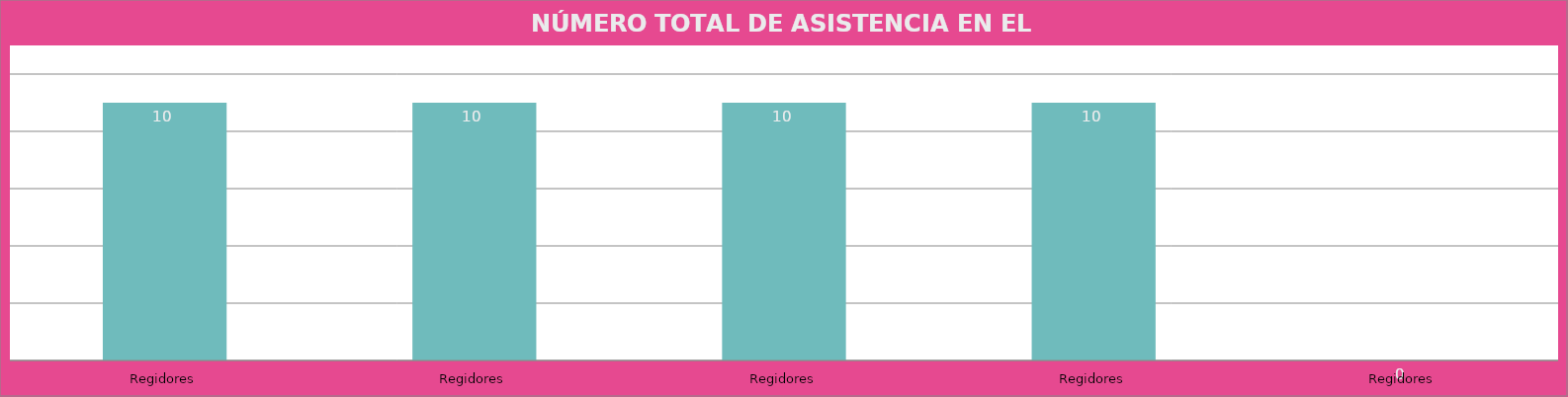
| Category | Regidores |
|---|---|
| Regidores | 10 |
| Regidores | 10 |
| Regidores | 10 |
| Regidores | 10 |
| Regidores | 0 |